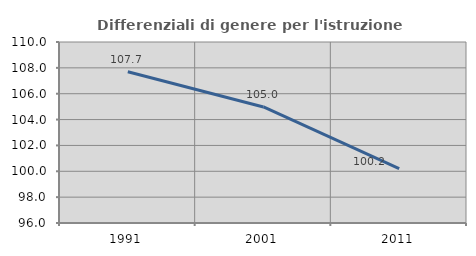
| Category | Differenziali di genere per l'istruzione superiore |
|---|---|
| 1991.0 | 107.701 |
| 2001.0 | 104.976 |
| 2011.0 | 100.211 |